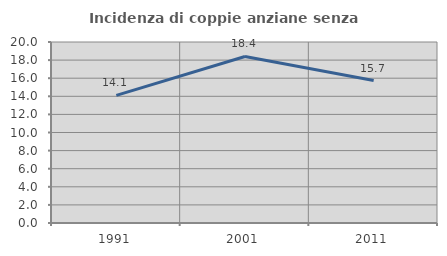
| Category | Incidenza di coppie anziane senza figli  |
|---|---|
| 1991.0 | 14.097 |
| 2001.0 | 18.404 |
| 2011.0 | 15.743 |